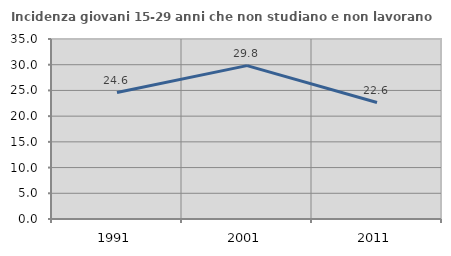
| Category | Incidenza giovani 15-29 anni che non studiano e non lavorano  |
|---|---|
| 1991.0 | 24.597 |
| 2001.0 | 29.825 |
| 2011.0 | 22.642 |